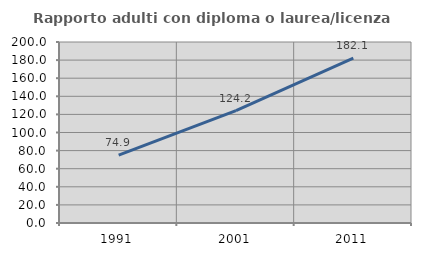
| Category | Rapporto adulti con diploma o laurea/licenza media  |
|---|---|
| 1991.0 | 74.915 |
| 2001.0 | 124.208 |
| 2011.0 | 182.092 |